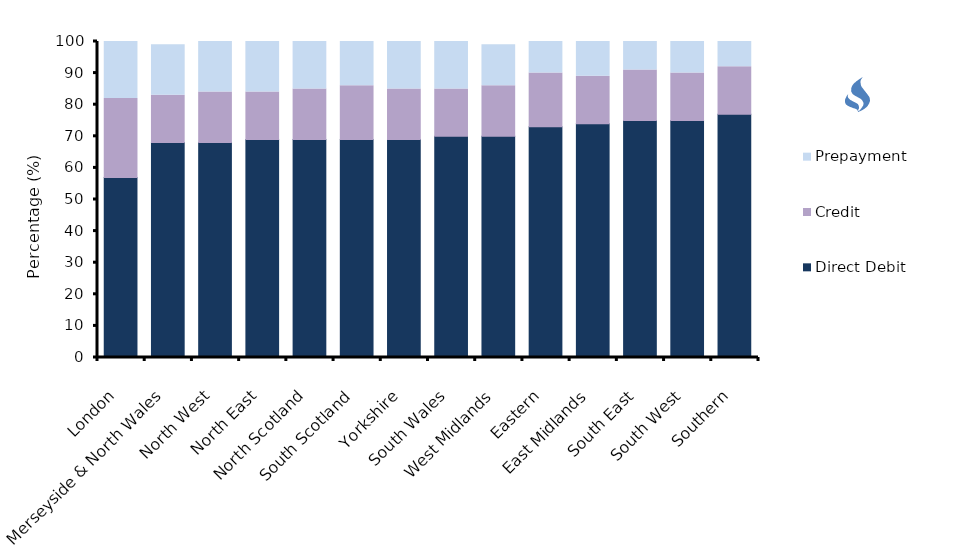
| Category | Direct Debit | Credit | Prepayment |
|---|---|---|---|
| London | 57 | 25 | 18 |
| Merseyside & North Wales | 68 | 15 | 16 |
| North West | 68 | 16 | 16 |
| North East | 69 | 15 | 16 |
| North Scotland | 69 | 16 | 15 |
| South Scotland | 69 | 17 | 14 |
| Yorkshire | 69 | 16 | 15 |
| South Wales | 70 | 15 | 15 |
| West Midlands | 70 | 16 | 13 |
| Eastern | 73 | 17 | 10 |
| East Midlands | 74 | 15 | 11 |
| South East | 75 | 16 | 10 |
| South West | 75 | 15 | 10 |
| Southern | 77 | 15 | 8 |